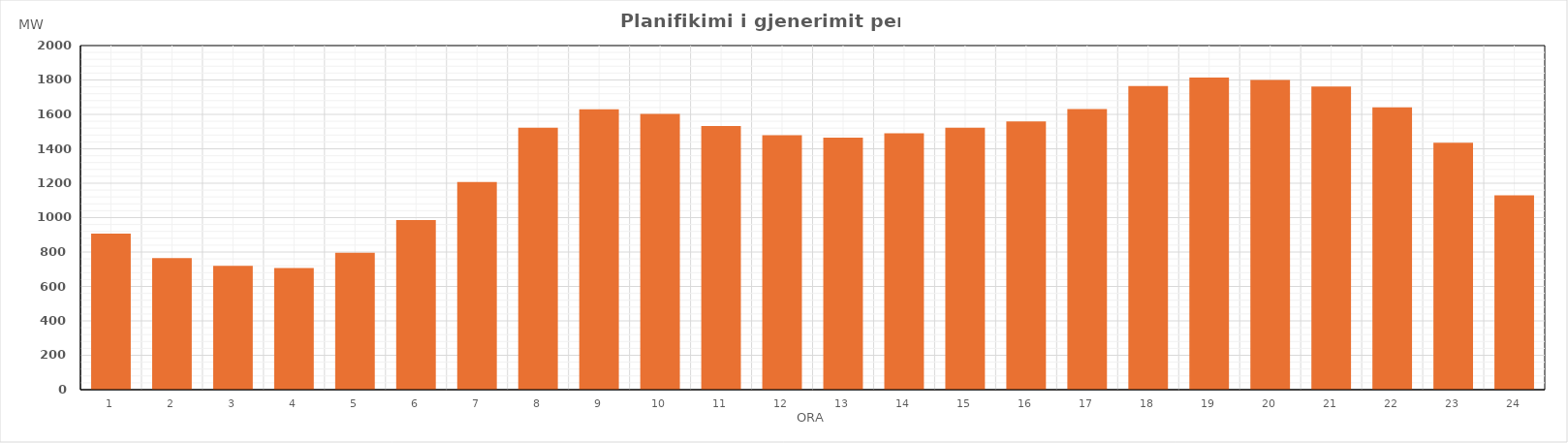
| Category | Max (MW) |
|---|---|
| 0 | 907 |
| 1 | 764.6 |
| 2 | 719.17 |
| 3 | 707.69 |
| 4 | 795.27 |
| 5 | 986.54 |
| 6 | 1207.59 |
| 7 | 1521.99 |
| 8 | 1629.07 |
| 9 | 1602.79 |
| 10 | 1533.04 |
| 11 | 1479.41 |
| 12 | 1464.86 |
| 13 | 1490.36 |
| 14 | 1522.99 |
| 15 | 1558.51 |
| 16 | 1631.25 |
| 17 | 1765.36 |
| 18 | 1814.46 |
| 19 | 1799.57 |
| 20 | 1761.83 |
| 21 | 1641.53 |
| 22 | 1434.54 |
| 23 | 1129.74 |